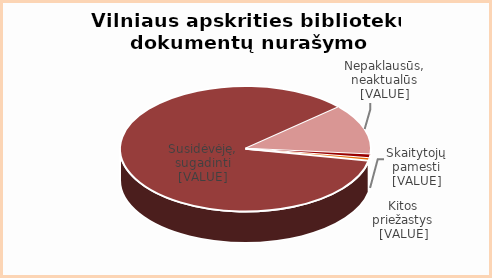
| Category | Series 0 |
|---|---|
| Susidėvėję | 0.85 |
| Nepaklausūs | 0.13 |
| Skaity | 0.01 |
| Kita | 0.006 |